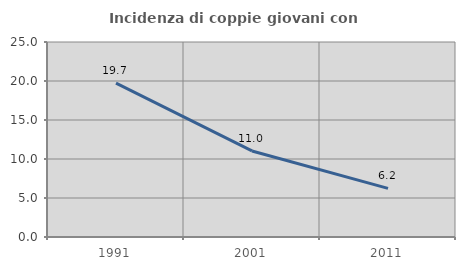
| Category | Incidenza di coppie giovani con figli |
|---|---|
| 1991.0 | 19.717 |
| 2001.0 | 11.03 |
| 2011.0 | 6.229 |